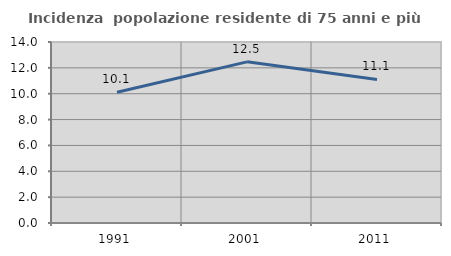
| Category | Incidenza  popolazione residente di 75 anni e più |
|---|---|
| 1991.0 | 10.117 |
| 2001.0 | 12.465 |
| 2011.0 | 11.105 |